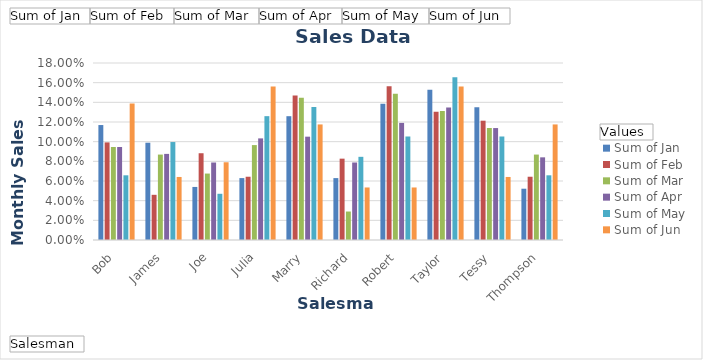
| Category | Sum of Jan | Sum of Feb | Sum of Mar | Sum of Apr | Sum of May | Sum of Jun |
|---|---|---|---|---|---|---|
| Bob | 0.117 | 0.099 | 0.095 | 0.095 | 0.066 | 0.139 |
| James | 0.099 | 0.046 | 0.087 | 0.088 | 0.1 | 0.064 |
| Joe | 0.054 | 0.088 | 0.068 | 0.079 | 0.047 | 0.079 |
| Julia | 0.063 | 0.064 | 0.097 | 0.103 | 0.126 | 0.156 |
| Marry | 0.126 | 0.147 | 0.145 | 0.105 | 0.135 | 0.118 |
| Richard | 0.063 | 0.083 | 0.029 | 0.079 | 0.085 | 0.053 |
| Robert | 0.138 | 0.156 | 0.149 | 0.119 | 0.105 | 0.053 |
| Taylor | 0.153 | 0.131 | 0.131 | 0.135 | 0.165 | 0.156 |
| Tessy | 0.135 | 0.121 | 0.114 | 0.114 | 0.105 | 0.064 |
| Thompson | 0.052 | 0.064 | 0.087 | 0.084 | 0.066 | 0.118 |